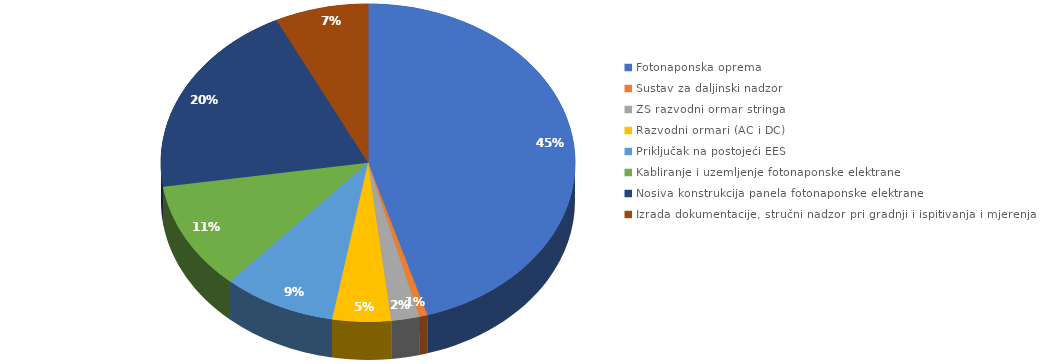
| Category | Series 0 |
|---|---|
| Fotonaponska oprema | 10340 |
| Sustav za daljinski nadzor | 145 |
| ZS razvodni ormar stringa | 500 |
| Razvodni ormari (AC i DC) | 1040 |
| Priključak na postojeći EES | 2008 |
| Kabliranje i uzemljenje fotonaponske elektrane | 2505 |
| Nosiva konstrukcija panela fotonaponske elektrane | 4588 |
| Izrada dokumentacije, stručni nadzor pri gradnji i ispitivanja i mjerenja | 1660 |